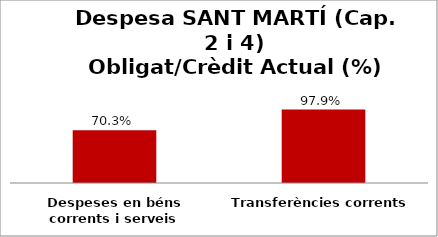
| Category | Series 0 |
|---|---|
| Despeses en béns corrents i serveis | 0.703 |
| Transferències corrents | 0.979 |